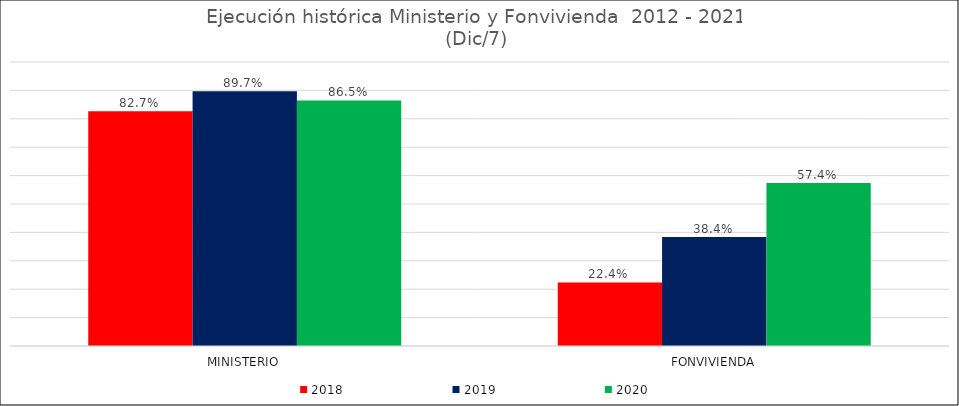
| Category | 2012 | 2013 | 2014 | 2015 | 2016 | 2017 | 2018 | 2019 | 2020 |
|---|---|---|---|---|---|---|---|---|---|
| MINISTERIO |  |  |  |  |  |  | 0.827 | 0.897 | 0.865 |
| FONVIVIENDA |  |  |  |  |  |  | 0.224 | 0.384 | 0.574 |